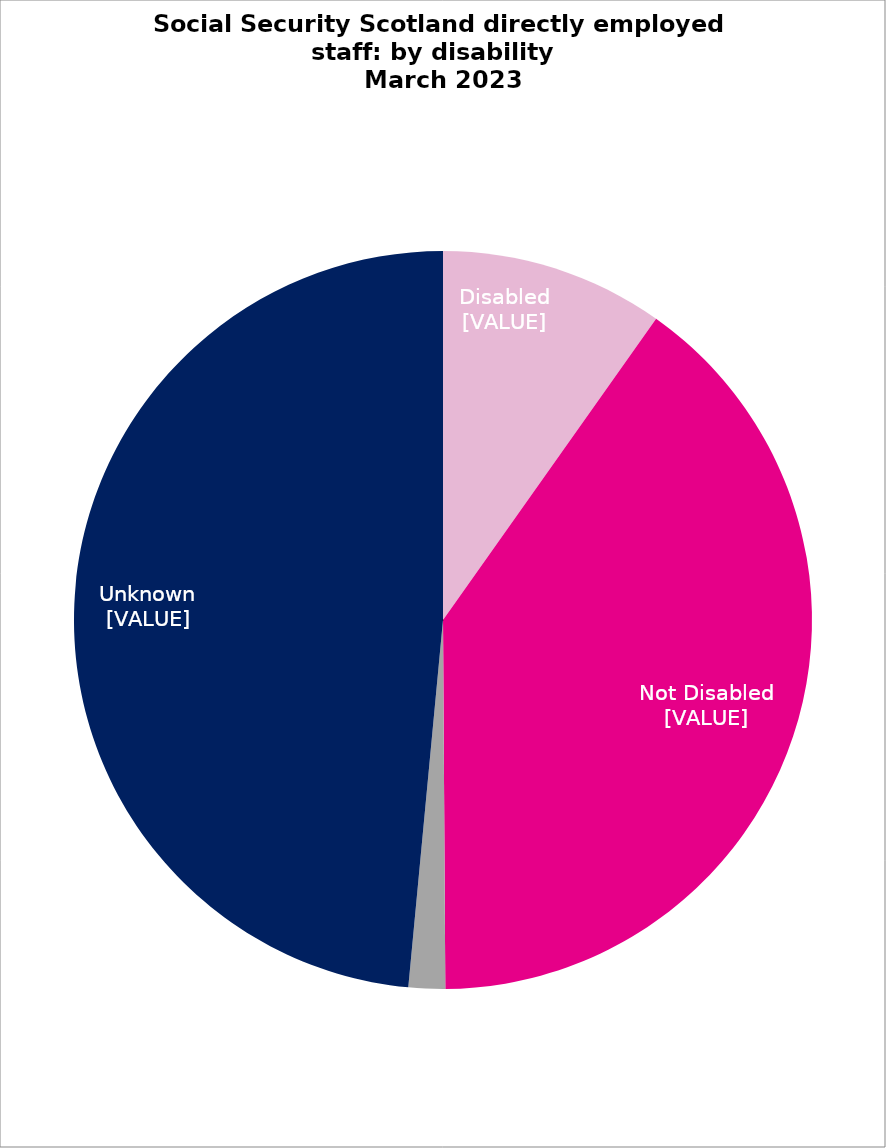
| Category | March 2023 |
|---|---|
| Disabled

 | 0.098 |
| Not Disabled

 | 0.401 |
| Prefer not to say
 | 0.016 |
| Unknown

 | 0.485 |